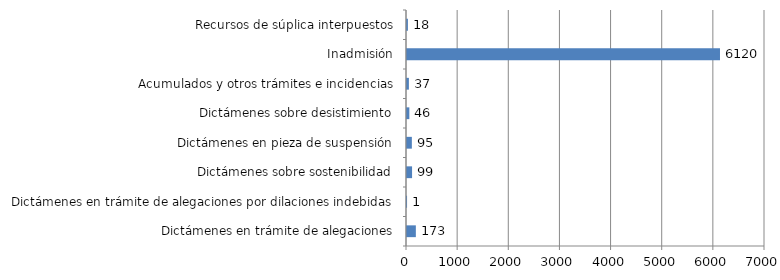
| Category | Series 0 |
|---|---|
| Dictámenes en trámite de alegaciones | 173 |
| Dictámenes en trámite de alegaciones por dilaciones indebidas | 1 |
| Dictámenes sobre sostenibilidad | 99 |
| Dictámenes en pieza de suspensión | 95 |
| Dictámenes sobre desistimiento | 46 |
| Acumulados y otros trámites e incidencias | 37 |
| Inadmisión | 6120 |
| Recursos de súplica interpuestos | 18 |